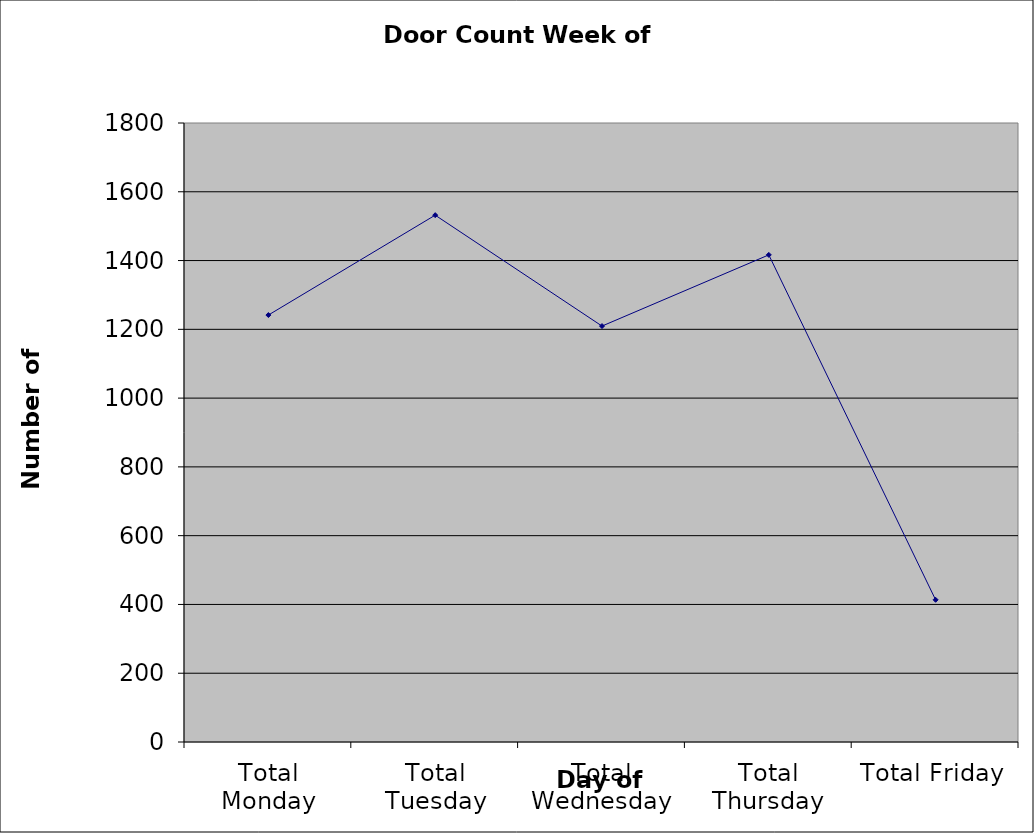
| Category | Series 0 |
|---|---|
| Total Monday | 1241.5 |
| Total Tuesday | 1532 |
| Total Wednesday | 1209.5 |
| Total Thursday | 1416.5 |
| Total Friday | 413.5 |